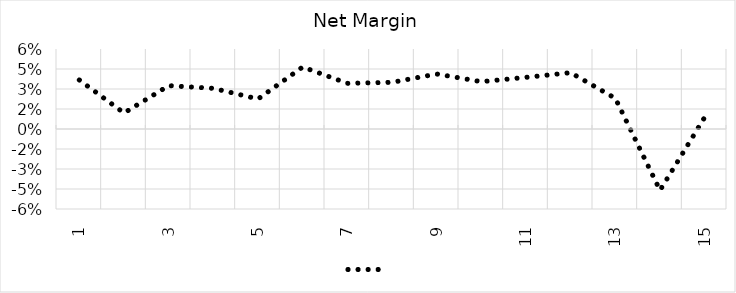
| Category | Series 0 |
|---|---|
| 0 | 0.037 |
| 1 | 0.012 |
| 2 | 0.032 |
| 3 | 0.03 |
| 4 | 0.022 |
| 5 | 0.046 |
| 6 | 0.034 |
| 7 | 0.035 |
| 8 | 0.041 |
| 9 | 0.036 |
| 10 | 0.039 |
| 11 | 0.042 |
| 12 | 0.023 |
| 13 | -0.046 |
| 14 | 0.009 |